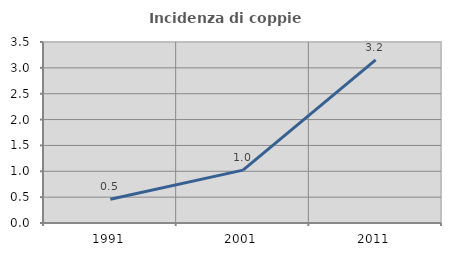
| Category | Incidenza di coppie miste |
|---|---|
| 1991.0 | 0.459 |
| 2001.0 | 1.023 |
| 2011.0 | 3.153 |